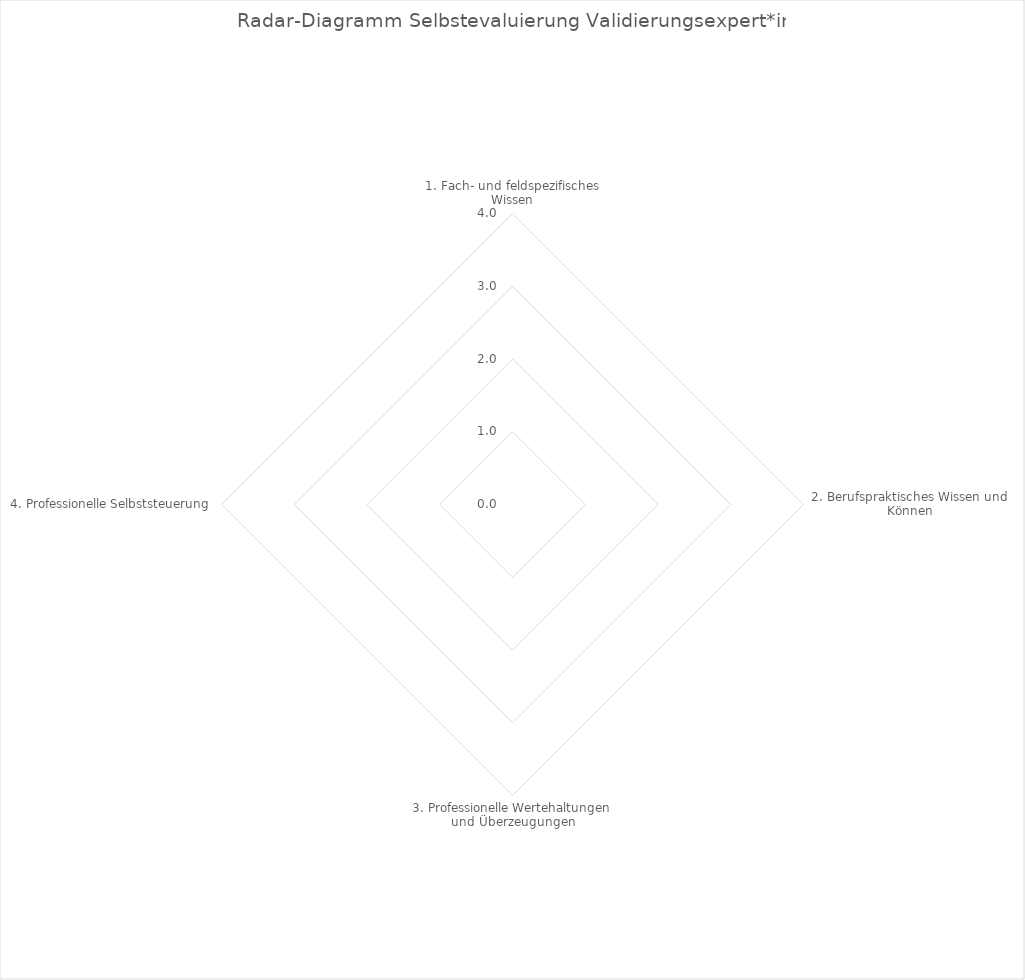
| Category | Series 0 |
|---|---|
| 1. Fach- und feldspezifisches Wissen | 0 |
| 2. Berufspraktisches Wissen und Können | 0 |
| 3. Professionelle Wertehaltungen und Überzeugungen | 0 |
| 4. Professionelle Selbststeuerung | 0 |